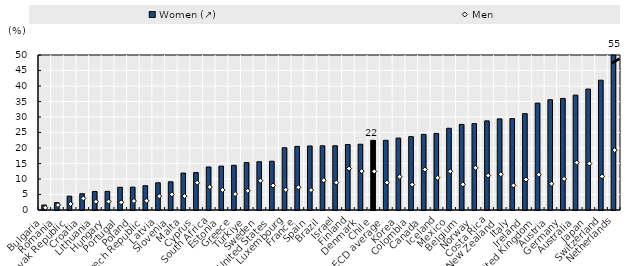
| Category | Women (↗) |
|---|---|
| Bulgaria | 1.622 |
| Romania | 2.372 |
| Slovak Republic | 4.467 |
| Croatia | 5.248 |
| Lithuania | 5.977 |
| Hungary | 6.008 |
| Portugal | 7.335 |
| Poland | 7.379 |
| Czech Republic | 7.847 |
| Latvia | 8.779 |
| Slovenia | 9.094 |
| Malta | 11.918 |
| Cyprus | 12.09 |
| South Africa | 13.885 |
| Estonia | 14.152 |
| Greece | 14.422 |
| Türkiye | 15.295 |
| Sweden | 15.572 |
| United States | 15.736 |
| Luxembourg | 20.082 |
| France | 20.523 |
| Spain | 20.654 |
| Brazil | 20.703 |
| Israel | 20.725 |
| Finland | 21.129 |
| Denmark | 21.211 |
| Chile | 22.473 |
| OECD average | 22.474 |
| Korea | 23.21 |
| Colombia | 23.669 |
| Canada | 24.385 |
| Iceland | 24.73 |
| Mexico | 26.363 |
| Belgium | 27.613 |
| Norway | 27.863 |
| Costa Rica | 28.746 |
| New Zealand | 29.399 |
| Italy | 29.483 |
| Ireland | 31.075 |
| United Kingdom | 34.482 |
| Austria | 35.563 |
| Germany | 35.985 |
| Australia | 37.057 |
| Japan | 39.016 |
| Switzerland | 41.869 |
| Netherlands | 54.653 |